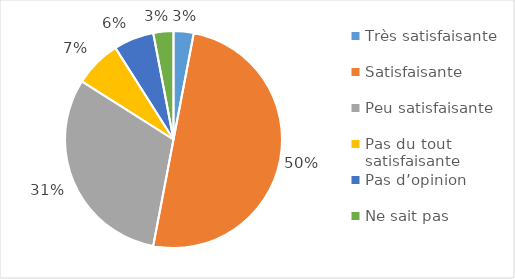
| Category | Series 0 |
|---|---|
| Très satisfaisante | 0.03 |
| Satisfaisante | 0.5 |
| Peu satisfaisante  | 0.31 |
| Pas du tout satisfaisante | 0.07 |
| Pas d’opinion | 0.06 |
| Ne sait pas | 0.03 |